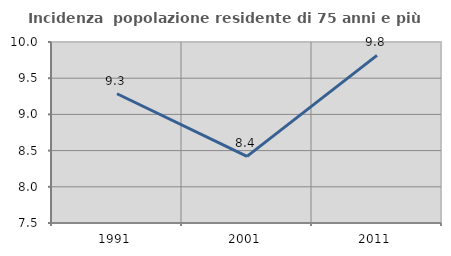
| Category | Incidenza  popolazione residente di 75 anni e più |
|---|---|
| 1991.0 | 9.285 |
| 2001.0 | 8.42 |
| 2011.0 | 9.815 |